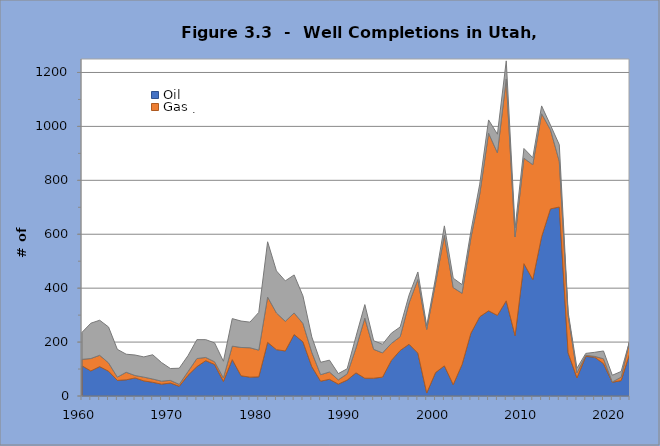
| Category | Oil | Gas | Total Dry |
|---|---|---|---|
| 1960.0 | 112 | 24 | 100 |
| 1961.0 | 93 | 46 | 131 |
| 1962.0 | 109 | 42 | 130 |
| 1963.0 | 92 | 31 | 133 |
| 1964.0 | 58 | 12 | 103 |
| 1965.0 | 60 | 28 | 67 |
| 1966.0 | 67 | 9 | 76 |
| 1967.0 | 56 | 14 | 75 |
| 1968.0 | 51 | 12 | 90 |
| 1969.0 | 44 | 11 | 69 |
| 1970.0 | 48 | 10 | 44 |
| 1971.0 | 36 | 7 | 60 |
| 1972.0 | 77 | 14 | 59 |
| 1973.0 | 109 | 30 | 70 |
| 1974.0 | 131 | 12 | 66 |
| 1975.0 | 117 | 10 | 70 |
| 1976.0 | 54 | 13 | 62 |
| 1977.0 | 135 | 50 | 102 |
| 1978.0 | 75 | 105 | 98 |
| 1979.0 | 70 | 109 | 95 |
| 1980.0 | 71 | 99 | 140 |
| 1981.0 | 199 | 168 | 205 |
| 1982.0 | 172 | 136 | 156 |
| 1983.0 | 167 | 110 | 150 |
| 1984.0 | 228 | 80 | 141 |
| 1985.0 | 201 | 68 | 102 |
| 1986.0 | 109 | 53 | 57 |
| 1987.0 | 55 | 24 | 46 |
| 1988.0 | 62 | 27 | 44 |
| 1989.0 | 44 | 16 | 23 |
| 1990.0 | 59 | 23 | 19 |
| 1991.0 | 86 | 92 | 43 |
| 1992.0 | 66 | 223 | 50 |
| 1993.0 | 66 | 107 | 32 |
| 1994.0 | 70 | 90 | 32 |
| 1995.0 | 132 | 63 | 38 |
| 1996.0 | 169 | 51 | 36 |
| 1997.0 | 192 | 153 | 29 |
| 1998.0 | 159 | 273 | 28 |
| 1999.0 | 11 | 236 | 13 |
| 2000.0 | 87 | 332 | 19 |
| 2001.0 | 112 | 484 | 35 |
| 2002.0 | 42 | 360 | 35 |
| 2003.0 | 117 | 264 | 32 |
| 2004.0 | 233 | 354 | 24 |
| 2005.0 | 294 | 455 | 37 |
| 2006.0 | 316 | 659 | 49 |
| 2007.0 | 299 | 603 | 69 |
| 2008.0 | 353 | 823 | 67 |
| 2009.0 | 224 | 366 | 33 |
| 2010.0 | 491 | 391 | 36 |
| 2011.0 | 432 | 426 | 26 |
| 2012.0 | 591 | 456 | 29 |
| 2013.0 | 694 | 294 | 17 |
| 2014.0 | 701 | 170 | 61 |
| 2015.0 | 160 | 140 | 11 |
| 2016.0 | 67 | 19 | 17 |
| 2017.0 | 147 | 4 | 7 |
| 2018.0 | 144 | 3 | 15 |
| 2019.0 | 120 | 18 | 29 |
| 2020.0 | 51 | 1 | 25 |
| 2021.0 | 57 | 13 | 21 |
| 2022.0 | 161 | 48 | 0 |